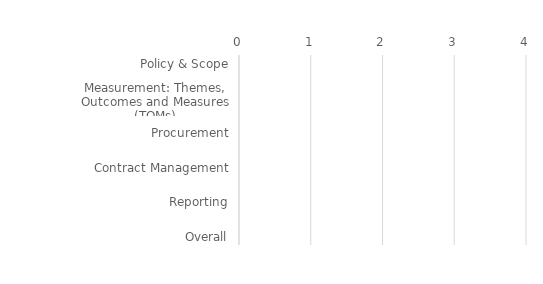
| Category | Future | Present |
|---|---|---|
| Policy & Scope | 0 | 0 |
| Internal Management | 0 | 0 |
| Measurement: Themes, Outcomes and Measures (TOMs) | 0 | 0 |
| Commissioning | 0 | 0 |
| Procurement | 0 | 0 |
| Market Engagement and Partnerships | 0 | 0 |
| Contract Management | 0 | 0 |
| Cross Sector Collaboration | 0 | 0 |
| Reporting | 0 | 0 |
| Governance and Accountability | 0 | 0 |
| Overall | 0 | 0 |